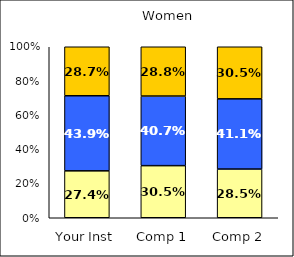
| Category | Low Overall Satisfaction | Average Overall Satisfaction | High Overall Satisfaction |
|---|---|---|---|
| Your Inst | 0.274 | 0.439 | 0.287 |
| Comp 1 | 0.305 | 0.407 | 0.288 |
| Comp 2 | 0.285 | 0.411 | 0.305 |